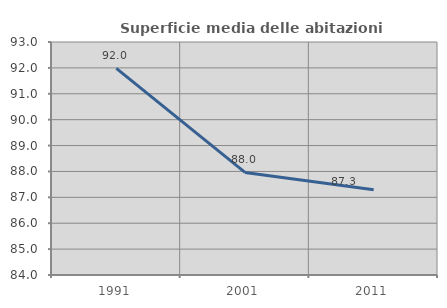
| Category | Superficie media delle abitazioni occupate |
|---|---|
| 1991.0 | 91.983 |
| 2001.0 | 87.963 |
| 2011.0 | 87.294 |